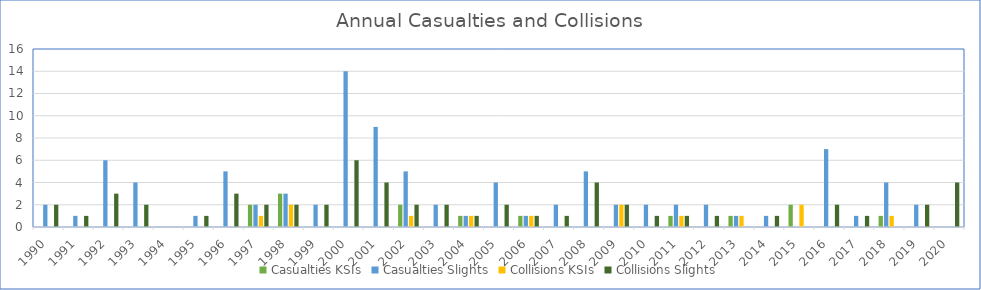
| Category | Casualties | Collisions |
|---|---|---|
| 1990.0 | 2 | 2 |
| 1991.0 | 1 | 1 |
| 1992.0 | 6 | 3 |
| 1993.0 | 4 | 2 |
| 1994.0 | 0 | 0 |
| 1995.0 | 1 | 1 |
| 1996.0 | 5 | 3 |
| 1997.0 | 2 | 2 |
| 1998.0 | 3 | 2 |
| 1999.0 | 2 | 2 |
| 2000.0 | 14 | 6 |
| 2001.0 | 9 | 4 |
| 2002.0 | 5 | 2 |
| 2003.0 | 2 | 2 |
| 2004.0 | 1 | 1 |
| 2005.0 | 4 | 2 |
| 2006.0 | 1 | 1 |
| 2007.0 | 2 | 1 |
| 2008.0 | 5 | 4 |
| 2009.0 | 2 | 2 |
| 2010.0 | 2 | 1 |
| 2011.0 | 2 | 1 |
| 2012.0 | 2 | 1 |
| 2013.0 | 1 | 0 |
| 2014.0 | 1 | 1 |
| 2015.0 | 0 | 0 |
| 2016.0 | 7 | 2 |
| 2017.0 | 1 | 1 |
| 2018.0 | 4 | 0 |
| 2019.0 | 2 | 2 |
| 2020.0 | 0 | 4 |